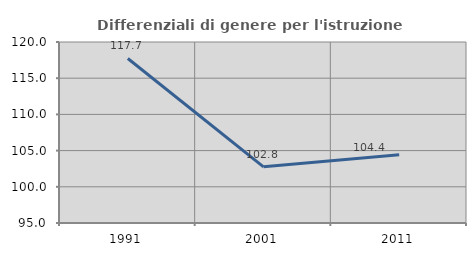
| Category | Differenziali di genere per l'istruzione superiore |
|---|---|
| 1991.0 | 117.727 |
| 2001.0 | 102.755 |
| 2011.0 | 104.426 |